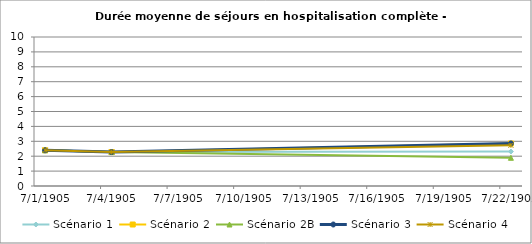
| Category | Scénario 1 | Scénario 2 | Scénario 2B | Scénario 3 | Scénario 4 |
|---|---|---|---|---|---|
| 2009.0 | 2.399 | 2.399 | 2.399 | 2.399 | 2.399 |
| 2012.0 | 2.278 | 2.278 | 2.278 | 2.278 | 2.278 |
| 2030.0 | 2.312 | 2.855 | 1.893 | 2.855 | 2.728 |